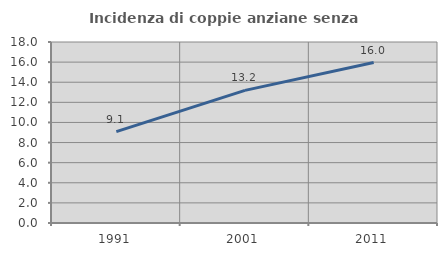
| Category | Incidenza di coppie anziane senza figli  |
|---|---|
| 1991.0 | 9.091 |
| 2001.0 | 13.187 |
| 2011.0 | 15.957 |